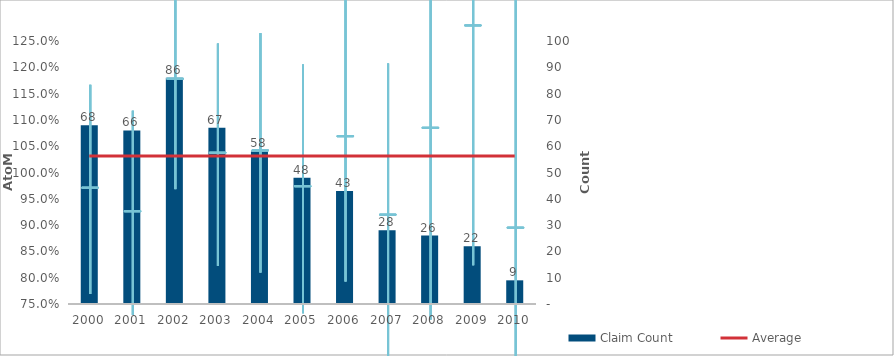
| Category | Claim Count |
|---|---|
| 0 | 68 |
| 1 | 66 |
| 2 | 86 |
| 3 | 67 |
| 4 | 58 |
| 5 | 48 |
| 6 | 43 |
| 7 | 28 |
| 8 | 26 |
| 9 | 22 |
| 10 | 9 |